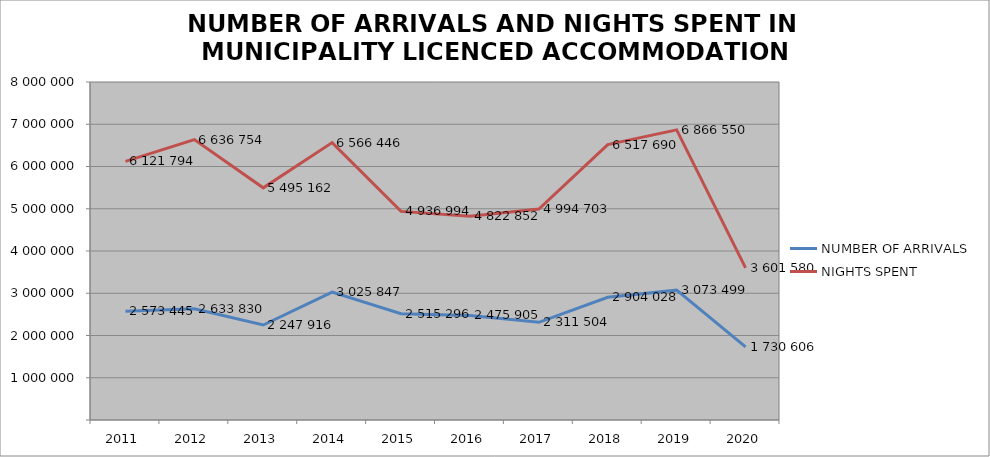
| Category | NUMBER OF ARRIVALS | NIGHTS SPENT |
|---|---|---|
| 2011 | 2573445 | 6121794 |
| 2012 | 2633830 | 6636754 |
| 2013 | 2247916 | 5495162 |
| 2014 | 3025847 | 6566446 |
| 2015 | 2515296 | 4936994 |
| 2016 | 2475905 | 4822852 |
| 2017 | 2311504 | 4994703 |
| 2018 | 2904028 | 6517690 |
| 2019 | 3073499 | 6866550 |
| 2020 | 1730606 | 3601580 |